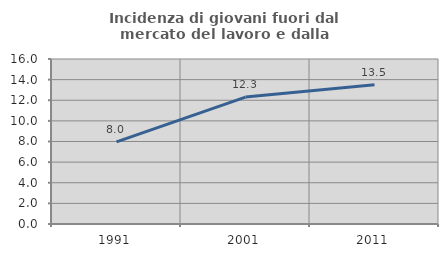
| Category | Incidenza di giovani fuori dal mercato del lavoro e dalla formazione  |
|---|---|
| 1991.0 | 7.965 |
| 2001.0 | 12.308 |
| 2011.0 | 13.514 |